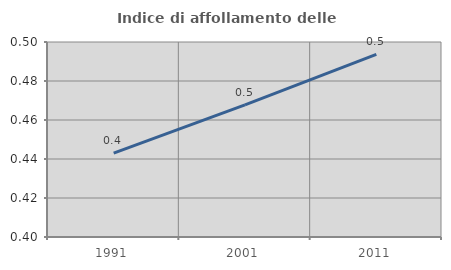
| Category | Indice di affollamento delle abitazioni  |
|---|---|
| 1991.0 | 0.443 |
| 2001.0 | 0.468 |
| 2011.0 | 0.494 |